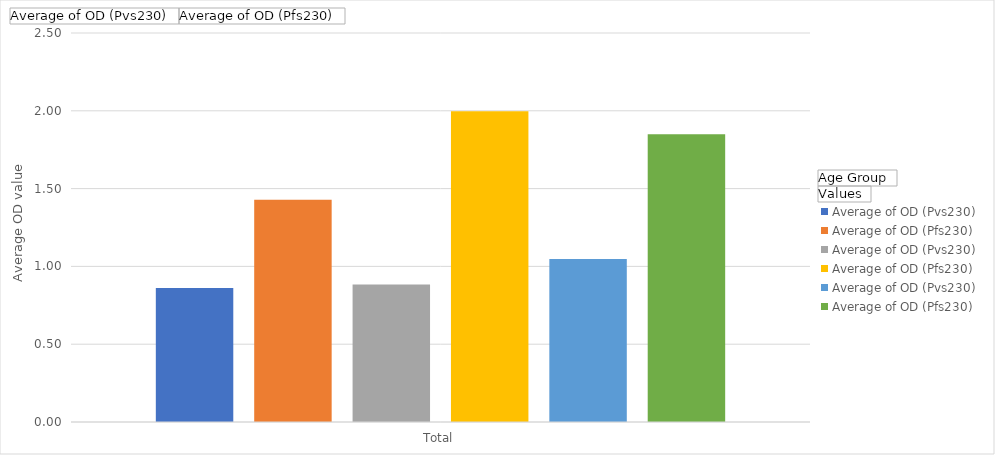
| Category | 1-9 years old - Average of OD (Pvs230) | 1-9 years old - Average of OD (Pfs230) | 10-19 years old - Average of OD (Pvs230) | 10-19 years old - Average of OD (Pfs230) | 20 or older - Average of OD (Pvs230) | 20 or older - Average of OD (Pfs230) |
|---|---|---|---|---|---|---|
| Total | 0.861 | 1.429 | 0.884 | 1.997 | 1.047 | 1.849 |